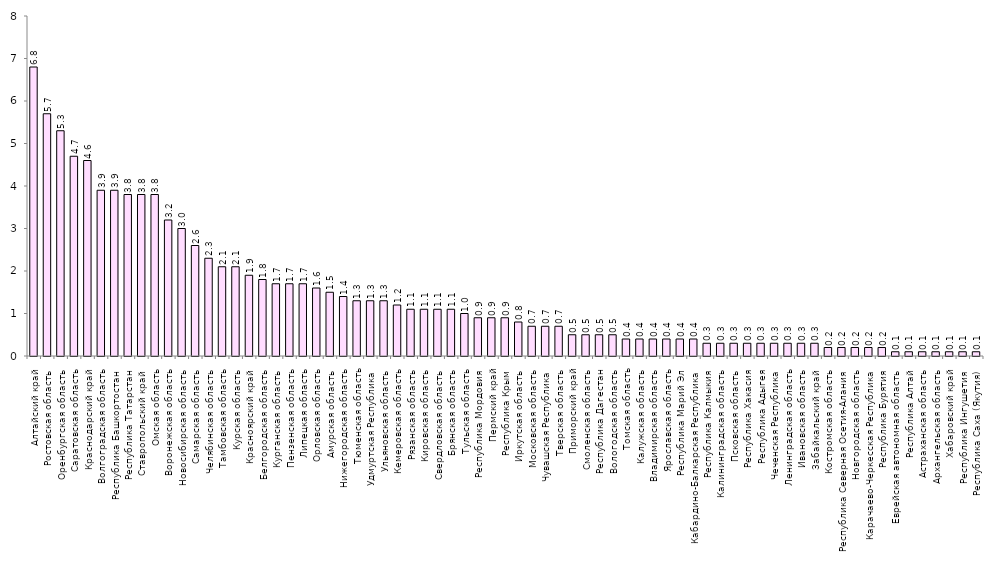
| Category | Series 0 |
|---|---|
| Алтайский край | 6.8 |
| Ростовская область | 5.7 |
| Оренбургская область | 5.3 |
| Саратовская область | 4.7 |
| Краснодарский край | 4.6 |
| Волгоградская область | 3.9 |
| Республика Башкортостан | 3.9 |
| Республика Татарстан | 3.8 |
| Ставропольский край | 3.8 |
| Омская область | 3.8 |
| Воронежская область | 3.2 |
| Новосибирская область | 3 |
| Самарская область | 2.6 |
| Челябинская область | 2.3 |
| Тамбовская область | 2.1 |
| Курская область | 2.1 |
| Красноярский край | 1.9 |
| Белгородская область | 1.8 |
| Курганская область | 1.7 |
| Пензенская область | 1.7 |
| Липецкая область | 1.7 |
| Орловская область | 1.6 |
| Амурская область | 1.5 |
| Нижегородская область | 1.4 |
| Тюменская область | 1.3 |
| Удмуртская Республика | 1.3 |
| Ульяновская область | 1.3 |
| Кемеровская область | 1.2 |
| Рязанская область | 1.1 |
| Кировская область | 1.1 |
| Свердловская область | 1.1 |
| Брянская область | 1.1 |
| Тульская область | 1 |
| Республика Мордовия | 0.9 |
| Пермский край | 0.9 |
| Республика Крым | 0.9 |
| Иркутская область | 0.8 |
| Московская область | 0.7 |
| Чувашская Республика | 0.7 |
| Тверская область | 0.7 |
| Приморский край | 0.5 |
| Смоленская область | 0.5 |
| Республика Дагестан | 0.5 |
| Вологодская область | 0.5 |
| Томская область | 0.4 |
| Калужская область | 0.4 |
| Владимирская область | 0.4 |
| Ярославская область | 0.4 |
| Республика Марий Эл | 0.4 |
| Кабардино-Балкарская Республика | 0.4 |
| Республика Калмыкия | 0.3 |
| Калининградская область | 0.3 |
| Псковская область | 0.3 |
| Республика Хакасия | 0.3 |
| Республика Адыгея | 0.3 |
| Чеченская Республика | 0.3 |
| Ленинградская область | 0.3 |
| Ивановская область | 0.3 |
| Забайкальский край | 0.3 |
| Костромская область | 0.2 |
| Республика Северная Осетия-Алания | 0.2 |
| Новгородская область | 0.2 |
| Карачаево-Черкесская Республика | 0.2 |
| Республика Бурятия | 0.2 |
| Еврейская автономная область | 0.1 |
| Республика Алтай | 0.1 |
| Астраханская область | 0.1 |
| Архангельская область | 0.1 |
| Хабаровский край | 0.1 |
| Республика Ингушетия | 0.1 |
| Республика Саха (Якутия) | 0.1 |